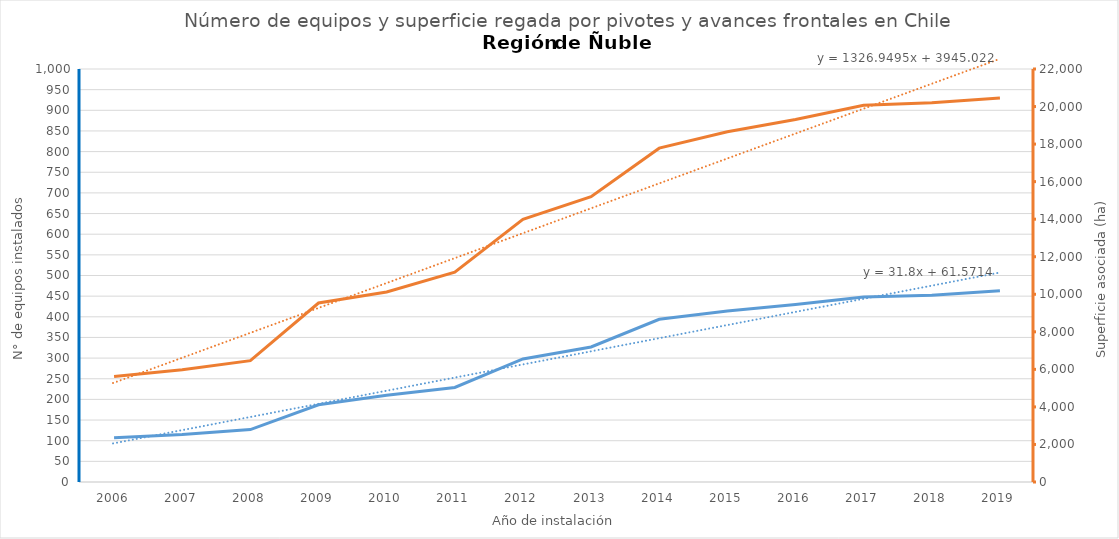
| Category | N° |
|---|---|
| 2006.0 | 107 |
| 2007.0 | 115 |
| 2008.0 | 127 |
| 2009.0 | 187 |
| 2010.0 | 210 |
| 2011.0 | 229 |
| 2012.0 | 298 |
| 2013.0 | 327 |
| 2014.0 | 394 |
| 2015.0 | 414 |
| 2016.0 | 430 |
| 2017.0 | 448 |
| 2018.0 | 452 |
| 2019.0 | 463 |